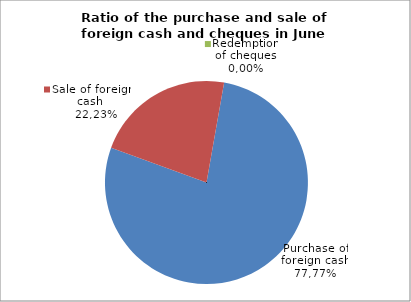
| Category | Purchase of foreign cash |
|---|---|
| 0 | 77.772 |
| 1 | 22.228 |
| 2 | 0 |